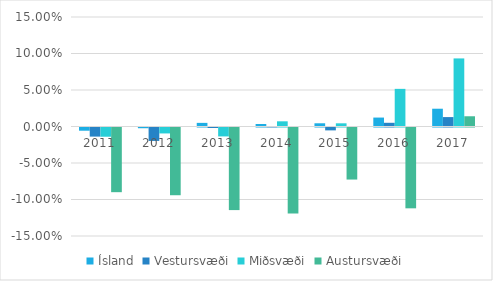
| Category | Ísland | Vestursvæði | Miðsvæði | Austursvæði |
|---|---|---|---|---|
| 2011.0 | -0.004 | -0.012 | -0.013 | -0.089 |
| 2012.0 | -0.001 | -0.018 | -0.008 | -0.093 |
| 2013.0 | 0.005 | -0.001 | -0.012 | -0.113 |
| 2014.0 | 0.003 | 0 | 0.007 | -0.118 |
| 2015.0 | 0.004 | -0.004 | 0.004 | -0.071 |
| 2016.0 | 0.012 | 0.005 | 0.052 | -0.111 |
| 2017.0 | 0.024 | 0.013 | 0.093 | 0.014 |